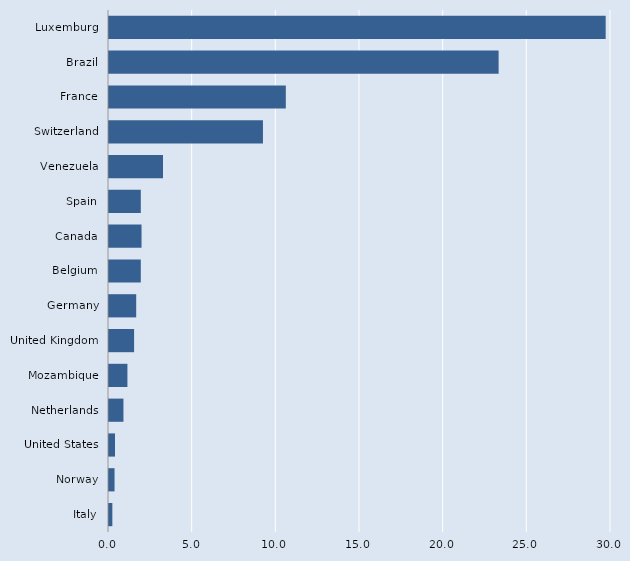
| Category | Series 0 |
|---|---|
| Italy | 0.2 |
| Norway | 0.332 |
| United States | 0.359 |
| Netherlands | 0.864 |
| Mozambique | 1.101 |
| United Kingdom | 1.5 |
| Germany | 1.626 |
| Belgium | 1.9 |
| Canada | 1.944 |
| Spain | 1.9 |
| Venezuela | 3.227 |
| Switzerland | 9.2 |
| France | 10.567 |
| Brazil | 23.284 |
| Luxemburg | 29.682 |